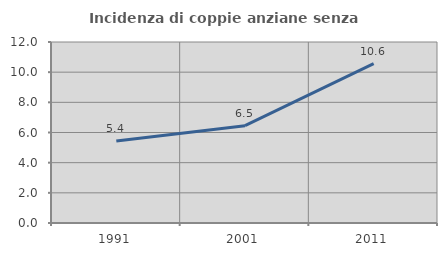
| Category | Incidenza di coppie anziane senza figli  |
|---|---|
| 1991.0 | 5.432 |
| 2001.0 | 6.452 |
| 2011.0 | 10.561 |